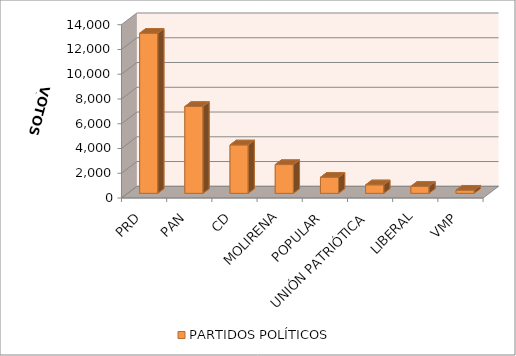
| Category | PARTIDOS POLÍTICOS |
|---|---|
| PRD | 12936 |
| PAN | 7017 |
| CD | 3911 |
| MOLIRENA | 2325 |
| POPULAR | 1296 |
| UNIÓN PATRIÓTICA | 686 |
| LIBERAL | 566 |
| VMP | 256 |